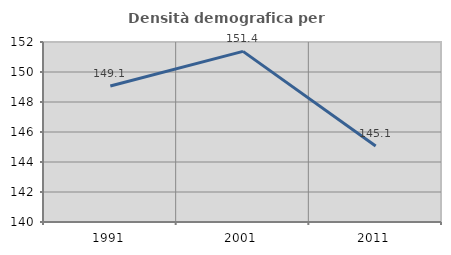
| Category | Densità demografica |
|---|---|
| 1991.0 | 149.064 |
| 2001.0 | 151.375 |
| 2011.0 | 145.065 |